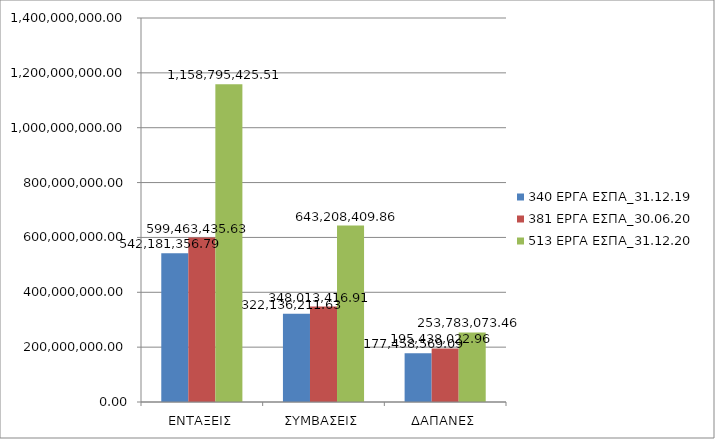
| Category | 340 ΕΡΓΑ ΕΣΠΑ_31.12.19 | 381 ΕΡΓΑ ΕΣΠΑ_30.06.20 | 513 ΕΡΓΑ ΕΣΠΑ_31.12.20 |
|---|---|---|---|
| ΕΝΤΑΞΕΙΣ | 542181356.793 | 599463435.633 | 1158795425.513 |
| ΣΥΜΒΑΣΕΙΣ | 322136211.633 | 348013416.913 | 643208409.863 |
| ΔΑΠΑΝΕΣ | 177458569.093 | 195438022.961 | 253783073.457 |